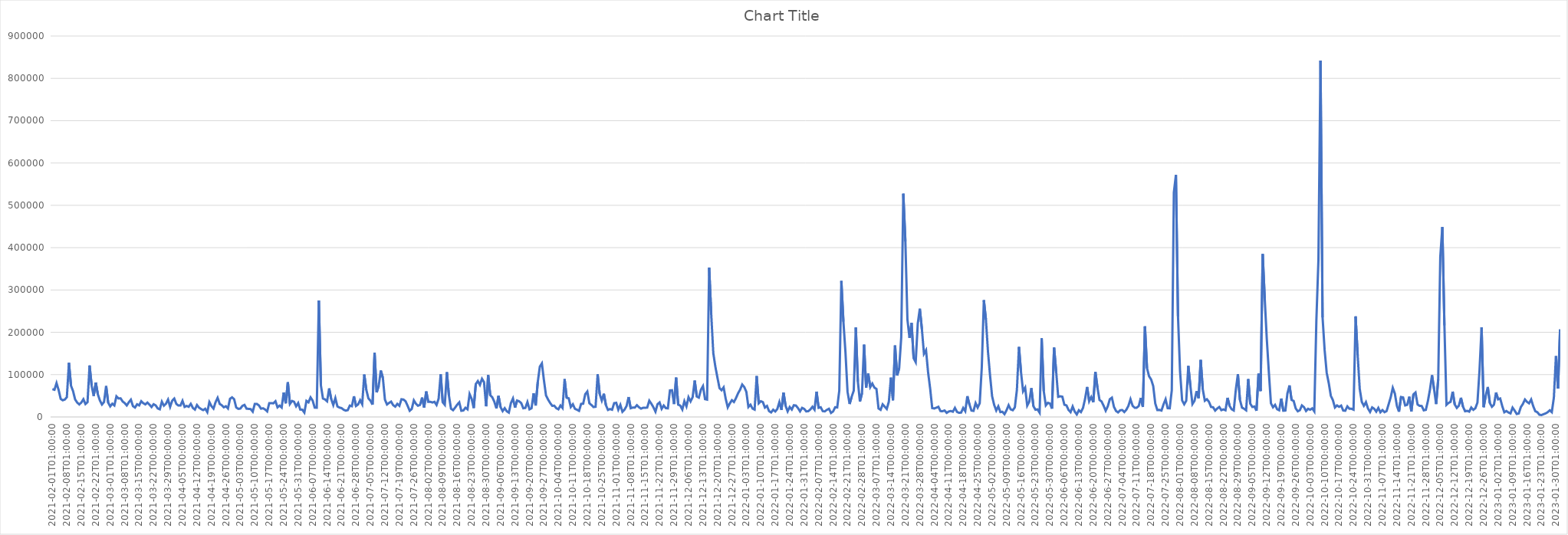
| Category | Series 0 |
|---|---|
| 2021-02-01T01:00:00 | 65672 |
| 2021-02-02T01:00:00 | 64260 |
| 2021-02-03T01:00:00 | 79995 |
| 2021-02-04T01:00:00 | 63845 |
| 2021-02-05T01:00:00 | 42728 |
| 2021-02-06T01:00:00 | 39410 |
| 2021-02-07T01:00:00 | 41108 |
| 2021-02-08T01:00:00 | 46871 |
| 2021-02-09T01:00:00 | 127957 |
| 2021-02-10T01:00:00 | 73947 |
| 2021-02-11T01:00:00 | 61066 |
| 2021-02-12T01:00:00 | 41321 |
| 2021-02-13T01:00:00 | 34094 |
| 2021-02-14T01:00:00 | 29640 |
| 2021-02-15T01:00:00 | 34106 |
| 2021-02-16T01:00:00 | 41888 |
| 2021-02-17T01:00:00 | 30526 |
| 2021-02-18T01:00:00 | 34901 |
| 2021-02-19T01:00:00 | 121660 |
| 2021-02-20T01:00:00 | 73907 |
| 2021-02-21T01:00:00 | 49578 |
| 2021-02-22T01:00:00 | 81334 |
| 2021-02-23T01:00:00 | 53755 |
| 2021-02-24T01:00:00 | 38993 |
| 2021-02-25T01:00:00 | 29401 |
| 2021-02-26T01:00:00 | 35380 |
| 2021-02-27T01:00:00 | 73096 |
| 2021-02-28T01:00:00 | 33897 |
| 2021-03-01T01:00:00 | 24981 |
| 2021-03-02T01:00:00 | 31299 |
| 2021-03-03T01:00:00 | 27234 |
| 2021-03-04T01:00:00 | 48728 |
| 2021-03-05T01:00:00 | 43712 |
| 2021-03-06T01:00:00 | 44058 |
| 2021-03-07T01:00:00 | 36648 |
| 2021-03-08T01:00:00 | 32808 |
| 2021-03-09T01:00:00 | 27239 |
| 2021-03-10T01:00:00 | 34722 |
| 2021-03-11T01:00:00 | 40857 |
| 2021-03-12T01:00:00 | 25597 |
| 2021-03-13T01:00:00 | 22263 |
| 2021-03-14T01:00:00 | 30014 |
| 2021-03-15T00:00:00 | 27374 |
| 2021-03-16T00:00:00 | 37203 |
| 2021-03-17T00:00:00 | 32582 |
| 2021-03-18T00:00:00 | 29691 |
| 2021-03-19T00:00:00 | 33996 |
| 2021-03-20T00:00:00 | 29189 |
| 2021-03-21T00:00:00 | 23487 |
| 2021-03-22T00:00:00 | 30058 |
| 2021-03-23T00:00:00 | 27351 |
| 2021-03-24T00:00:00 | 20125 |
| 2021-03-25T00:00:00 | 18106 |
| 2021-03-26T00:00:00 | 36141 |
| 2021-03-27T00:00:00 | 26642 |
| 2021-03-28T00:00:00 | 31400 |
| 2021-03-29T00:00:00 | 41045 |
| 2021-03-30T00:00:00 | 23882 |
| 2021-03-31T00:00:00 | 38320 |
| 2021-04-01T00:00:00 | 43522 |
| 2021-04-02T00:00:00 | 30898 |
| 2021-04-03T00:00:00 | 27024 |
| 2021-04-04T00:00:00 | 26956 |
| 2021-04-05T00:00:00 | 38240 |
| 2021-04-06T00:00:00 | 23710 |
| 2021-04-07T00:00:00 | 26003 |
| 2021-04-08T00:00:00 | 23984 |
| 2021-04-09T00:00:00 | 31038 |
| 2021-04-10T00:00:00 | 21359 |
| 2021-04-11T00:00:00 | 17455 |
| 2021-04-12T00:00:00 | 28206 |
| 2021-04-13T00:00:00 | 22050 |
| 2021-04-14T00:00:00 | 18752 |
| 2021-04-15T00:00:00 | 16161 |
| 2021-04-16T00:00:00 | 19416 |
| 2021-04-17T00:00:00 | 11334 |
| 2021-04-18T00:00:00 | 35177 |
| 2021-04-19T00:00:00 | 25709 |
| 2021-04-20T00:00:00 | 19833 |
| 2021-04-21T00:00:00 | 34809 |
| 2021-04-22T00:00:00 | 45259 |
| 2021-04-23T00:00:00 | 30862 |
| 2021-04-24T00:00:00 | 27719 |
| 2021-04-25T00:00:00 | 22890 |
| 2021-04-26T00:00:00 | 25357 |
| 2021-04-27T00:00:00 | 20082 |
| 2021-04-28T00:00:00 | 42960 |
| 2021-04-29T00:00:00 | 46387 |
| 2021-04-30T00:00:00 | 41825 |
| 2021-05-01T00:00:00 | 22451 |
| 2021-05-02T00:00:00 | 19210 |
| 2021-05-03T00:00:00 | 19776 |
| 2021-05-04T00:00:00 | 26215 |
| 2021-05-05T00:00:00 | 28557 |
| 2021-05-06T00:00:00 | 19639 |
| 2021-05-07T00:00:00 | 19103 |
| 2021-05-08T00:00:00 | 18651 |
| 2021-05-09T00:00:00 | 12586 |
| 2021-05-10T00:00:00 | 30774 |
| 2021-05-11T00:00:00 | 30790 |
| 2021-05-12T00:00:00 | 27195 |
| 2021-05-13T00:00:00 | 19657 |
| 2021-05-14T00:00:00 | 20478 |
| 2021-05-15T00:00:00 | 17670 |
| 2021-05-16T00:00:00 | 13167 |
| 2021-05-17T00:00:00 | 32656 |
| 2021-05-18T00:00:00 | 32775 |
| 2021-05-19T00:00:00 | 32116 |
| 2021-05-20T00:00:00 | 37208 |
| 2021-05-21T00:00:00 | 22746 |
| 2021-05-22T00:00:00 | 26787 |
| 2021-05-23T00:00:00 | 22321 |
| 2021-05-24T00:00:00 | 57836 |
| 2021-05-25T00:00:00 | 32246 |
| 2021-05-26T00:00:00 | 81969 |
| 2021-05-27T00:00:00 | 30822 |
| 2021-05-28T00:00:00 | 37786 |
| 2021-05-29T00:00:00 | 35920 |
| 2021-05-30T00:00:00 | 25176 |
| 2021-05-31T00:00:00 | 32861 |
| 2021-06-01T00:00:00 | 17646 |
| 2021-06-02T00:00:00 | 17164 |
| 2021-06-03T00:00:00 | 10293 |
| 2021-06-04T00:00:00 | 38009 |
| 2021-06-05T00:00:00 | 34675 |
| 2021-06-06T00:00:00 | 46235 |
| 2021-06-07T00:00:00 | 38835 |
| 2021-06-08T00:00:00 | 22152 |
| 2021-06-09T00:00:00 | 21870 |
| 2021-06-10T00:00:00 | 275252 |
| 2021-06-11T00:00:00 | 74616 |
| 2021-06-12T00:00:00 | 43384 |
| 2021-06-13T00:00:00 | 41416 |
| 2021-06-14T00:00:00 | 36906 |
| 2021-06-15T00:00:00 | 67450 |
| 2021-06-16T00:00:00 | 42242 |
| 2021-06-17T00:00:00 | 28146 |
| 2021-06-18T00:00:00 | 44510 |
| 2021-06-19T00:00:00 | 24843 |
| 2021-06-20T00:00:00 | 22150 |
| 2021-06-21T00:00:00 | 20943 |
| 2021-06-22T00:00:00 | 17123 |
| 2021-06-23T00:00:00 | 14956 |
| 2021-06-24T00:00:00 | 16110 |
| 2021-06-25T00:00:00 | 26907 |
| 2021-06-26T00:00:00 | 25375 |
| 2021-06-27T00:00:00 | 48822 |
| 2021-06-28T00:00:00 | 25978 |
| 2021-06-29T00:00:00 | 29505 |
| 2021-06-30T00:00:00 | 39580 |
| 2021-07-01T00:00:00 | 30052 |
| 2021-07-02T00:00:00 | 100248 |
| 2021-07-03T00:00:00 | 63694 |
| 2021-07-04T00:00:00 | 44030 |
| 2021-07-05T00:00:00 | 38350 |
| 2021-07-06T00:00:00 | 29018 |
| 2021-07-07T00:00:00 | 152164 |
| 2021-07-08T00:00:00 | 58113 |
| 2021-07-09T00:00:00 | 73364 |
| 2021-07-10T00:00:00 | 109778 |
| 2021-07-11T00:00:00 | 92630 |
| 2021-07-12T00:00:00 | 41001 |
| 2021-07-13T00:00:00 | 29524 |
| 2021-07-14T00:00:00 | 33191 |
| 2021-07-15T00:00:00 | 36226 |
| 2021-07-16T00:00:00 | 27824 |
| 2021-07-17T00:00:00 | 24438 |
| 2021-07-18T00:00:00 | 30852 |
| 2021-07-19T00:00:00 | 26362 |
| 2021-07-20T00:00:00 | 41823 |
| 2021-07-21T00:00:00 | 41080 |
| 2021-07-22T00:00:00 | 37055 |
| 2021-07-23T00:00:00 | 26325 |
| 2021-07-24T00:00:00 | 14607 |
| 2021-07-25T00:00:00 | 18933 |
| 2021-07-26T00:00:00 | 39277 |
| 2021-07-27T00:00:00 | 31332 |
| 2021-07-28T00:00:00 | 26533 |
| 2021-07-29T00:00:00 | 28481 |
| 2021-07-30T00:00:00 | 45856 |
| 2021-07-31T00:00:00 | 22383 |
| 2021-08-01T00:00:00 | 60249 |
| 2021-08-02T00:00:00 | 35597 |
| 2021-08-03T00:00:00 | 35816 |
| 2021-08-04T00:00:00 | 34180 |
| 2021-08-05T00:00:00 | 35801 |
| 2021-08-06T00:00:00 | 28451 |
| 2021-08-07T00:00:00 | 42882 |
| 2021-08-08T00:00:00 | 100564 |
| 2021-08-09T00:00:00 | 34582 |
| 2021-08-10T00:00:00 | 28708 |
| 2021-08-11T00:00:00 | 105883 |
| 2021-08-12T00:00:00 | 50389 |
| 2021-08-13T00:00:00 | 19563 |
| 2021-08-14T00:00:00 | 15996 |
| 2021-08-15T00:00:00 | 22111 |
| 2021-08-16T00:00:00 | 29130 |
| 2021-08-17T00:00:00 | 34452 |
| 2021-08-18T00:00:00 | 14557 |
| 2021-08-19T00:00:00 | 15358 |
| 2021-08-20T00:00:00 | 21807 |
| 2021-08-21T00:00:00 | 18116 |
| 2021-08-22T00:00:00 | 54100 |
| 2021-08-23T00:00:00 | 42732 |
| 2021-08-24T00:00:00 | 21084 |
| 2021-08-25T00:00:00 | 77770 |
| 2021-08-26T00:00:00 | 84763 |
| 2021-08-27T00:00:00 | 75836 |
| 2021-08-28T00:00:00 | 90168 |
| 2021-08-29T00:00:00 | 82269 |
| 2021-08-30T00:00:00 | 25286 |
| 2021-08-31T00:00:00 | 99043 |
| 2021-09-01T00:00:00 | 51444 |
| 2021-09-02T00:00:00 | 46396 |
| 2021-09-03T00:00:00 | 35709 |
| 2021-09-04T00:00:00 | 20093 |
| 2021-09-05T00:00:00 | 49844 |
| 2021-09-06T00:00:00 | 23138 |
| 2021-09-07T00:00:00 | 13827 |
| 2021-09-08T00:00:00 | 20747 |
| 2021-09-09T00:00:00 | 13442 |
| 2021-09-10T00:00:00 | 10293 |
| 2021-09-11T00:00:00 | 32770 |
| 2021-09-12T00:00:00 | 43735 |
| 2021-09-13T00:00:00 | 22172 |
| 2021-09-14T00:00:00 | 38833 |
| 2021-09-15T00:00:00 | 36999 |
| 2021-09-16T00:00:00 | 32784 |
| 2021-09-17T00:00:00 | 20556 |
| 2021-09-18T00:00:00 | 21323 |
| 2021-09-19T00:00:00 | 35329 |
| 2021-09-20T00:00:00 | 18109 |
| 2021-09-21T00:00:00 | 20584 |
| 2021-09-22T00:00:00 | 55996 |
| 2021-09-23T00:00:00 | 27077 |
| 2021-09-24T00:00:00 | 82150 |
| 2021-09-25T00:00:00 | 118814 |
| 2021-09-26T00:00:00 | 126527 |
| 2021-09-27T00:00:00 | 86629 |
| 2021-09-28T00:00:00 | 50790 |
| 2021-09-29T00:00:00 | 41155 |
| 2021-09-30T00:00:00 | 33165 |
| 2021-10-01T00:00:00 | 26433 |
| 2021-10-02T00:00:00 | 26520 |
| 2021-10-03T00:00:00 | 20688 |
| 2021-10-04T00:00:00 | 18093 |
| 2021-10-05T00:00:00 | 27022 |
| 2021-10-06T00:00:00 | 21246 |
| 2021-10-07T00:00:00 | 89484 |
| 2021-10-08T00:00:00 | 45358 |
| 2021-10-09T00:00:00 | 44105 |
| 2021-10-10T00:00:00 | 23522 |
| 2021-10-11T00:00:00 | 30016 |
| 2021-10-12T00:00:00 | 19293 |
| 2021-10-13T00:00:00 | 17090 |
| 2021-10-14T00:00:00 | 14427 |
| 2021-10-15T00:00:00 | 30951 |
| 2021-10-16T00:00:00 | 31371 |
| 2021-10-17T00:00:00 | 53865 |
| 2021-10-18T00:00:00 | 60102 |
| 2021-10-19T00:00:00 | 32415 |
| 2021-10-20T00:00:00 | 28184 |
| 2021-10-21T00:00:00 | 23365 |
| 2021-10-22T00:00:00 | 24191 |
| 2021-10-23T00:00:00 | 100782 |
| 2021-10-24T00:00:00 | 54060 |
| 2021-10-25T00:00:00 | 38789 |
| 2021-10-26T00:00:00 | 54945 |
| 2021-10-27T00:00:00 | 28030 |
| 2021-10-28T00:00:00 | 16583 |
| 2021-10-29T00:00:00 | 18741 |
| 2021-10-30T00:00:00 | 17093 |
| 2021-10-31T00:00:00 | 32629 |
| 2021-11-01T00:00:00 | 33486 |
| 2021-11-02T00:00:00 | 17263 |
| 2021-11-03T00:00:00 | 28520 |
| 2021-11-04T00:00:00 | 12155 |
| 2021-11-05T00:00:00 | 17244 |
| 2021-11-06T00:00:00 | 25794 |
| 2021-11-07T00:00:00 | 47032 |
| 2021-11-08T01:00:00 | 20616 |
| 2021-11-09T01:00:00 | 22281 |
| 2021-11-10T01:00:00 | 22108 |
| 2021-11-11T01:00:00 | 27737 |
| 2021-11-12T01:00:00 | 22989 |
| 2021-11-13T01:00:00 | 19714 |
| 2021-11-14T01:00:00 | 21616 |
| 2021-11-15T01:00:00 | 21651 |
| 2021-11-16T01:00:00 | 22176 |
| 2021-11-17T01:00:00 | 38487 |
| 2021-11-18T01:00:00 | 31295 |
| 2021-11-19T01:00:00 | 22983 |
| 2021-11-20T01:00:00 | 12558 |
| 2021-11-21T01:00:00 | 30204 |
| 2021-11-22T01:00:00 | 34311 |
| 2021-11-23T01:00:00 | 19203 |
| 2021-11-24T01:00:00 | 27055 |
| 2021-11-25T01:00:00 | 20861 |
| 2021-11-26T01:00:00 | 20337 |
| 2021-11-27T01:00:00 | 62671 |
| 2021-11-28T01:00:00 | 63131 |
| 2021-11-29T01:00:00 | 30375 |
| 2021-11-30T01:00:00 | 92855 |
| 2021-12-01T01:00:00 | 29150 |
| 2021-12-02T01:00:00 | 26844 |
| 2021-12-03T01:00:00 | 17671 |
| 2021-12-04T01:00:00 | 37128 |
| 2021-12-05T01:00:00 | 25029 |
| 2021-12-06T01:00:00 | 46677 |
| 2021-12-07T01:00:00 | 36782 |
| 2021-12-08T01:00:00 | 46797 |
| 2021-12-09T01:00:00 | 86024 |
| 2021-12-10T01:00:00 | 48376 |
| 2021-12-11T01:00:00 | 45637 |
| 2021-12-12T01:00:00 | 64095 |
| 2021-12-13T01:00:00 | 72784 |
| 2021-12-14T01:00:00 | 42051 |
| 2021-12-15T01:00:00 | 40826 |
| 2021-12-16T01:00:00 | 352617 |
| 2021-12-17T01:00:00 | 242459 |
| 2021-12-18T01:00:00 | 150759 |
| 2021-12-19T01:00:00 | 118842 |
| 2021-12-20T01:00:00 | 93136 |
| 2021-12-21T01:00:00 | 68306 |
| 2021-12-22T01:00:00 | 63130 |
| 2021-12-23T01:00:00 | 69894 |
| 2021-12-24T01:00:00 | 43127 |
| 2021-12-25T01:00:00 | 22736 |
| 2021-12-26T01:00:00 | 32070 |
| 2021-12-27T01:00:00 | 39636 |
| 2021-12-28T01:00:00 | 35391 |
| 2021-12-29T01:00:00 | 44764 |
| 2021-12-30T01:00:00 | 55990 |
| 2021-12-31T01:00:00 | 64654 |
| 2022-01-01T01:00:00 | 76608 |
| 2022-01-02T01:00:00 | 70601 |
| 2022-01-03T01:00:00 | 59465 |
| 2022-01-04T01:00:00 | 23627 |
| 2022-01-05T01:00:00 | 29002 |
| 2022-01-06T01:00:00 | 19791 |
| 2022-01-07T01:00:00 | 17376 |
| 2022-01-08T01:00:00 | 96623 |
| 2022-01-09T01:00:00 | 32295 |
| 2022-01-10T01:00:00 | 37271 |
| 2022-01-11T01:00:00 | 35101 |
| 2022-01-12T01:00:00 | 22147 |
| 2022-01-13T01:00:00 | 25994 |
| 2022-01-14T01:00:00 | 13746 |
| 2022-01-15T01:00:00 | 10725 |
| 2022-01-16T01:00:00 | 17143 |
| 2022-01-17T01:00:00 | 12985 |
| 2022-01-18T01:00:00 | 18897 |
| 2022-01-19T01:00:00 | 35182 |
| 2022-01-20T01:00:00 | 16646 |
| 2022-01-21T01:00:00 | 57508 |
| 2022-01-22T01:00:00 | 26363 |
| 2022-01-23T01:00:00 | 13174 |
| 2022-01-24T01:00:00 | 23536 |
| 2022-01-25T01:00:00 | 17610 |
| 2022-01-26T01:00:00 | 27732 |
| 2022-01-27T01:00:00 | 27000 |
| 2022-01-28T01:00:00 | 21012 |
| 2022-01-29T01:00:00 | 13261 |
| 2022-01-30T01:00:00 | 21467 |
| 2022-01-31T01:00:00 | 19107 |
| 2022-02-01T01:00:00 | 13168 |
| 2022-02-02T01:00:00 | 13669 |
| 2022-02-03T01:00:00 | 17734 |
| 2022-02-04T01:00:00 | 24024 |
| 2022-02-05T01:00:00 | 17293 |
| 2022-02-06T01:00:00 | 59824 |
| 2022-02-07T01:00:00 | 21505 |
| 2022-02-08T01:00:00 | 23034 |
| 2022-02-09T01:00:00 | 13738 |
| 2022-02-10T01:00:00 | 13118 |
| 2022-02-11T01:00:00 | 16879 |
| 2022-02-12T01:00:00 | 19542 |
| 2022-02-13T01:00:00 | 9393 |
| 2022-02-14T01:00:00 | 12931 |
| 2022-02-15T01:00:00 | 22986 |
| 2022-02-16T01:00:00 | 22523 |
| 2022-02-17T01:00:00 | 62092 |
| 2022-02-18T01:00:00 | 321465 |
| 2022-02-19T01:00:00 | 225341 |
| 2022-02-20T01:00:00 | 152486 |
| 2022-02-21T01:00:00 | 59463 |
| 2022-02-22T01:00:00 | 30562 |
| 2022-02-23T01:00:00 | 47752 |
| 2022-02-24T01:00:00 | 61857 |
| 2022-02-25T01:00:00 | 211515 |
| 2022-02-26T01:00:00 | 83686 |
| 2022-02-27T01:00:00 | 36496 |
| 2022-02-28T01:00:00 | 56110 |
| 2022-03-01T01:00:00 | 170923 |
| 2022-03-02T01:00:00 | 69180 |
| 2022-03-03T01:00:00 | 102516 |
| 2022-03-04T01:00:00 | 70507 |
| 2022-03-05T01:00:00 | 78852 |
| 2022-03-06T01:00:00 | 69358 |
| 2022-03-07T01:00:00 | 66237 |
| 2022-03-08T01:00:00 | 20061 |
| 2022-03-09T01:00:00 | 16847 |
| 2022-03-10T01:00:00 | 29828 |
| 2022-03-11T01:00:00 | 24414 |
| 2022-03-12T01:00:00 | 18921 |
| 2022-03-13T01:00:00 | 36163 |
| 2022-03-14T00:00:00 | 92951 |
| 2022-03-15T00:00:00 | 39426 |
| 2022-03-16T00:00:00 | 168879 |
| 2022-03-17T00:00:00 | 97923 |
| 2022-03-18T00:00:00 | 115005 |
| 2022-03-19T00:00:00 | 188512 |
| 2022-03-20T00:00:00 | 527535 |
| 2022-03-21T00:00:00 | 414820 |
| 2022-03-22T00:00:00 | 230133 |
| 2022-03-23T00:00:00 | 186902 |
| 2022-03-24T00:00:00 | 221971 |
| 2022-03-25T00:00:00 | 138855 |
| 2022-03-26T00:00:00 | 129630 |
| 2022-03-27T00:00:00 | 220591 |
| 2022-03-28T00:00:00 | 255724 |
| 2022-03-29T00:00:00 | 207561 |
| 2022-03-30T00:00:00 | 149214 |
| 2022-03-31T00:00:00 | 157800 |
| 2022-04-01T00:00:00 | 105536 |
| 2022-04-02T00:00:00 | 67170 |
| 2022-04-03T00:00:00 | 20969 |
| 2022-04-04T00:00:00 | 20050 |
| 2022-04-05T00:00:00 | 21915 |
| 2022-04-06T00:00:00 | 24003 |
| 2022-04-07T00:00:00 | 13859 |
| 2022-04-08T00:00:00 | 13592 |
| 2022-04-09T00:00:00 | 15234 |
| 2022-04-10T00:00:00 | 9689 |
| 2022-04-11T00:00:00 | 12863 |
| 2022-04-12T00:00:00 | 14092 |
| 2022-04-13T00:00:00 | 12445 |
| 2022-04-14T00:00:00 | 21455 |
| 2022-04-15T00:00:00 | 11947 |
| 2022-04-16T00:00:00 | 9754 |
| 2022-04-17T00:00:00 | 10400 |
| 2022-04-18T00:00:00 | 21337 |
| 2022-04-19T00:00:00 | 13706 |
| 2022-04-20T00:00:00 | 49089 |
| 2022-04-21T00:00:00 | 29879 |
| 2022-04-22T00:00:00 | 15085 |
| 2022-04-23T00:00:00 | 14468 |
| 2022-04-24T00:00:00 | 32813 |
| 2022-04-25T00:00:00 | 22299 |
| 2022-04-26T00:00:00 | 32329 |
| 2022-04-27T00:00:00 | 117297 |
| 2022-04-28T00:00:00 | 275978 |
| 2022-04-29T00:00:00 | 230174 |
| 2022-04-30T00:00:00 | 154042 |
| 2022-05-01T00:00:00 | 98201 |
| 2022-05-02T00:00:00 | 48786 |
| 2022-05-03T00:00:00 | 28458 |
| 2022-05-04T00:00:00 | 15343 |
| 2022-05-05T00:00:00 | 25097 |
| 2022-05-06T00:00:00 | 11522 |
| 2022-05-07T00:00:00 | 12280 |
| 2022-05-08T00:00:00 | 6702 |
| 2022-05-09T00:00:00 | 15970 |
| 2022-05-10T00:00:00 | 27766 |
| 2022-05-11T00:00:00 | 17934 |
| 2022-05-12T00:00:00 | 15915 |
| 2022-05-13T00:00:00 | 22557 |
| 2022-05-14T00:00:00 | 63868 |
| 2022-05-15T00:00:00 | 165475 |
| 2022-05-16T00:00:00 | 105065 |
| 2022-05-17T00:00:00 | 60671 |
| 2022-05-18T00:00:00 | 69154 |
| 2022-05-19T00:00:00 | 26957 |
| 2022-05-20T00:00:00 | 36311 |
| 2022-05-21T00:00:00 | 68112 |
| 2022-05-22T00:00:00 | 25486 |
| 2022-05-23T00:00:00 | 17111 |
| 2022-05-24T00:00:00 | 17868 |
| 2022-05-25T00:00:00 | 10074 |
| 2022-05-26T00:00:00 | 185834 |
| 2022-05-27T00:00:00 | 61407 |
| 2022-05-28T00:00:00 | 27239 |
| 2022-05-29T00:00:00 | 33354 |
| 2022-05-30T00:00:00 | 31928 |
| 2022-05-31T00:00:00 | 19753 |
| 2022-06-01T00:00:00 | 163861 |
| 2022-06-02T00:00:00 | 107755 |
| 2022-06-03T00:00:00 | 47494 |
| 2022-06-04T00:00:00 | 48892 |
| 2022-06-05T00:00:00 | 47905 |
| 2022-06-06T00:00:00 | 28815 |
| 2022-06-07T00:00:00 | 27348 |
| 2022-06-08T00:00:00 | 16737 |
| 2022-06-09T00:00:00 | 11416 |
| 2022-06-10T00:00:00 | 24743 |
| 2022-06-11T00:00:00 | 12592 |
| 2022-06-12T00:00:00 | 6003 |
| 2022-06-13T00:00:00 | 15900 |
| 2022-06-14T00:00:00 | 11555 |
| 2022-06-15T00:00:00 | 21080 |
| 2022-06-16T00:00:00 | 42529 |
| 2022-06-17T00:00:00 | 70885 |
| 2022-06-18T00:00:00 | 37184 |
| 2022-06-19T00:00:00 | 47117 |
| 2022-06-20T00:00:00 | 34899 |
| 2022-06-21T00:00:00 | 106681 |
| 2022-06-22T00:00:00 | 69366 |
| 2022-06-23T00:00:00 | 40235 |
| 2022-06-24T00:00:00 | 36591 |
| 2022-06-25T00:00:00 | 26424 |
| 2022-06-26T00:00:00 | 14726 |
| 2022-06-27T00:00:00 | 25082 |
| 2022-06-28T00:00:00 | 41988 |
| 2022-06-29T00:00:00 | 45625 |
| 2022-06-30T00:00:00 | 23685 |
| 2022-07-01T00:00:00 | 14144 |
| 2022-07-02T00:00:00 | 10729 |
| 2022-07-03T00:00:00 | 15867 |
| 2022-07-04T00:00:00 | 16378 |
| 2022-07-05T00:00:00 | 11601 |
| 2022-07-06T00:00:00 | 17121 |
| 2022-07-07T00:00:00 | 26314 |
| 2022-07-08T00:00:00 | 41843 |
| 2022-07-09T00:00:00 | 26766 |
| 2022-07-10T00:00:00 | 21905 |
| 2022-07-11T00:00:00 | 21893 |
| 2022-07-12T00:00:00 | 25875 |
| 2022-07-13T00:00:00 | 45095 |
| 2022-07-14T00:00:00 | 23712 |
| 2022-07-15T00:00:00 | 214040 |
| 2022-07-16T00:00:00 | 115229 |
| 2022-07-17T00:00:00 | 96350 |
| 2022-07-18T00:00:00 | 88440 |
| 2022-07-19T00:00:00 | 73129 |
| 2022-07-20T00:00:00 | 31600 |
| 2022-07-21T00:00:00 | 16385 |
| 2022-07-22T00:00:00 | 16554 |
| 2022-07-23T00:00:00 | 15170 |
| 2022-07-24T00:00:00 | 29841 |
| 2022-07-25T00:00:00 | 41750 |
| 2022-07-26T00:00:00 | 20654 |
| 2022-07-27T00:00:00 | 20579 |
| 2022-07-28T00:00:00 | 63277 |
| 2022-07-29T00:00:00 | 530562 |
| 2022-07-30T00:00:00 | 571868 |
| 2022-07-31T00:00:00 | 238718 |
| 2022-08-01T00:00:00 | 107339 |
| 2022-08-02T00:00:00 | 39211 |
| 2022-08-03T00:00:00 | 30051 |
| 2022-08-04T00:00:00 | 38425 |
| 2022-08-05T00:00:00 | 120802 |
| 2022-08-06T00:00:00 | 73366 |
| 2022-08-07T00:00:00 | 30537 |
| 2022-08-08T00:00:00 | 37968 |
| 2022-08-09T00:00:00 | 60909 |
| 2022-08-10T00:00:00 | 44391 |
| 2022-08-11T00:00:00 | 134688 |
| 2022-08-12T00:00:00 | 65327 |
| 2022-08-13T00:00:00 | 38359 |
| 2022-08-14T00:00:00 | 41918 |
| 2022-08-15T00:00:00 | 35812 |
| 2022-08-16T00:00:00 | 23762 |
| 2022-08-17T00:00:00 | 22964 |
| 2022-08-18T00:00:00 | 15058 |
| 2022-08-19T00:00:00 | 19892 |
| 2022-08-20T00:00:00 | 23550 |
| 2022-08-21T00:00:00 | 16072 |
| 2022-08-22T00:00:00 | 17901 |
| 2022-08-23T00:00:00 | 15820 |
| 2022-08-24T00:00:00 | 45210 |
| 2022-08-25T00:00:00 | 25936 |
| 2022-08-26T00:00:00 | 18210 |
| 2022-08-27T00:00:00 | 15357 |
| 2022-08-28T00:00:00 | 64441 |
| 2022-08-29T00:00:00 | 101001 |
| 2022-08-30T00:00:00 | 40314 |
| 2022-08-31T00:00:00 | 22017 |
| 2022-09-01T00:00:00 | 19478 |
| 2022-09-02T00:00:00 | 15763 |
| 2022-09-03T00:00:00 | 89563 |
| 2022-09-04T00:00:00 | 31414 |
| 2022-09-05T00:00:00 | 23607 |
| 2022-09-06T00:00:00 | 24690 |
| 2022-09-07T00:00:00 | 14562 |
| 2022-09-08T00:00:00 | 102309 |
| 2022-09-09T00:00:00 | 61184 |
| 2022-09-10T00:00:00 | 384967 |
| 2022-09-11T00:00:00 | 279576 |
| 2022-09-12T00:00:00 | 184073 |
| 2022-09-13T00:00:00 | 105297 |
| 2022-09-14T00:00:00 | 32462 |
| 2022-09-15T00:00:00 | 22909 |
| 2022-09-16T00:00:00 | 28661 |
| 2022-09-17T00:00:00 | 18296 |
| 2022-09-18T00:00:00 | 15701 |
| 2022-09-19T00:00:00 | 43523 |
| 2022-09-20T00:00:00 | 14738 |
| 2022-09-21T00:00:00 | 15177 |
| 2022-09-22T00:00:00 | 55924 |
| 2022-09-23T00:00:00 | 74533 |
| 2022-09-24T00:00:00 | 40245 |
| 2022-09-25T00:00:00 | 37874 |
| 2022-09-26T00:00:00 | 20196 |
| 2022-09-27T00:00:00 | 13288 |
| 2022-09-28T00:00:00 | 15833 |
| 2022-09-29T00:00:00 | 27146 |
| 2022-09-30T00:00:00 | 23264 |
| 2022-10-01T00:00:00 | 14207 |
| 2022-10-02T00:00:00 | 19269 |
| 2022-10-03T00:00:00 | 17038 |
| 2022-10-04T00:00:00 | 20399 |
| 2022-10-05T00:00:00 | 13148 |
| 2022-10-06T00:00:00 | 227480 |
| 2022-10-07T00:00:00 | 370930 |
| 2022-10-08T00:00:00 | 842110 |
| 2022-10-09T00:00:00 | 235469 |
| 2022-10-10T00:00:00 | 158128 |
| 2022-10-11T00:00:00 | 104605 |
| 2022-10-12T00:00:00 | 79898 |
| 2022-10-13T00:00:00 | 50056 |
| 2022-10-14T00:00:00 | 39590 |
| 2022-10-15T00:00:00 | 22406 |
| 2022-10-16T00:00:00 | 27214 |
| 2022-10-17T00:00:00 | 23975 |
| 2022-10-18T00:00:00 | 26714 |
| 2022-10-19T00:00:00 | 15416 |
| 2022-10-20T00:00:00 | 14888 |
| 2022-10-21T00:00:00 | 25018 |
| 2022-10-22T00:00:00 | 19296 |
| 2022-10-23T00:00:00 | 19418 |
| 2022-10-24T00:00:00 | 17338 |
| 2022-10-25T00:00:00 | 237546 |
| 2022-10-26T00:00:00 | 145742 |
| 2022-10-27T00:00:00 | 66301 |
| 2022-10-28T00:00:00 | 35683 |
| 2022-10-29T00:00:00 | 26423 |
| 2022-10-30T00:00:00 | 35075 |
| 2022-10-31T00:00:00 | 19956 |
| 2022-11-01T00:00:00 | 11885 |
| 2022-11-02T00:00:00 | 22591 |
| 2022-11-03T00:00:00 | 19344 |
| 2022-11-04T00:00:00 | 12512 |
| 2022-11-05T00:00:00 | 21344 |
| 2022-11-06T00:00:00 | 11027 |
| 2022-11-07T01:00:00 | 16363 |
| 2022-11-08T01:00:00 | 11277 |
| 2022-11-09T01:00:00 | 13914 |
| 2022-11-10T01:00:00 | 30097 |
| 2022-11-11T01:00:00 | 46549 |
| 2022-11-12T01:00:00 | 68778 |
| 2022-11-13T01:00:00 | 55396 |
| 2022-11-14T01:00:00 | 26229 |
| 2022-11-15T01:00:00 | 12454 |
| 2022-11-16T01:00:00 | 47132 |
| 2022-11-17T01:00:00 | 46113 |
| 2022-11-18T01:00:00 | 27256 |
| 2022-11-19T01:00:00 | 28724 |
| 2022-11-20T01:00:00 | 47923 |
| 2022-11-21T01:00:00 | 13143 |
| 2022-11-22T01:00:00 | 53368 |
| 2022-11-23T01:00:00 | 57766 |
| 2022-11-24T01:00:00 | 29470 |
| 2022-11-25T01:00:00 | 26287 |
| 2022-11-26T01:00:00 | 25955 |
| 2022-11-27T01:00:00 | 15673 |
| 2022-11-28T01:00:00 | 16768 |
| 2022-11-29T01:00:00 | 37485 |
| 2022-11-30T01:00:00 | 64564 |
| 2022-12-01T01:00:00 | 98628 |
| 2022-12-02T01:00:00 | 65677 |
| 2022-12-03T01:00:00 | 30426 |
| 2022-12-04T01:00:00 | 88738 |
| 2022-12-05T01:00:00 | 378229 |
| 2022-12-06T01:00:00 | 448701 |
| 2022-12-07T01:00:00 | 216379 |
| 2022-12-08T01:00:00 | 28780 |
| 2022-12-09T01:00:00 | 33277 |
| 2022-12-10T01:00:00 | 35955 |
| 2022-12-11T01:00:00 | 59865 |
| 2022-12-12T01:00:00 | 29541 |
| 2022-12-13T01:00:00 | 21397 |
| 2022-12-14T01:00:00 | 26792 |
| 2022-12-15T01:00:00 | 45345 |
| 2022-12-16T01:00:00 | 24204 |
| 2022-12-17T01:00:00 | 13601 |
| 2022-12-18T01:00:00 | 14597 |
| 2022-12-19T01:00:00 | 12645 |
| 2022-12-20T01:00:00 | 22248 |
| 2022-12-21T01:00:00 | 16768 |
| 2022-12-22T01:00:00 | 20600 |
| 2022-12-23T01:00:00 | 34136 |
| 2022-12-24T01:00:00 | 110463 |
| 2022-12-25T01:00:00 | 211800 |
| 2022-12-26T01:00:00 | 23087 |
| 2022-12-27T01:00:00 | 50252 |
| 2022-12-28T01:00:00 | 70789 |
| 2022-12-29T01:00:00 | 32834 |
| 2022-12-30T01:00:00 | 24136 |
| 2022-12-31T01:00:00 | 29116 |
| 2023-01-01T01:00:00 | 57677 |
| 2023-01-02T01:00:00 | 41658 |
| 2023-01-03T01:00:00 | 43639 |
| 2023-01-04T01:00:00 | 25874 |
| 2023-01-05T01:00:00 | 11079 |
| 2023-01-06T01:00:00 | 14076 |
| 2023-01-07T01:00:00 | 10567 |
| 2023-01-08T01:00:00 | 8446 |
| 2023-01-09T01:00:00 | 22077 |
| 2023-01-10T01:00:00 | 15088 |
| 2023-01-11T01:00:00 | 7045 |
| 2023-01-12T01:00:00 | 8223 |
| 2023-01-13T01:00:00 | 23291 |
| 2023-01-14T01:00:00 | 30795 |
| 2023-01-15T01:00:00 | 41230 |
| 2023-01-16T01:00:00 | 35648 |
| 2023-01-17T01:00:00 | 32269 |
| 2023-01-18T01:00:00 | 41253 |
| 2023-01-19T01:00:00 | 25533 |
| 2023-01-20T01:00:00 | 13603 |
| 2023-01-21T01:00:00 | 11208 |
| 2023-01-22T01:00:00 | 5262 |
| 2023-01-23T01:00:00 | 4532 |
| 2023-01-24T01:00:00 | 6514 |
| 2023-01-25T01:00:00 | 8388 |
| 2023-01-26T01:00:00 | 11180 |
| 2023-01-27T01:00:00 | 15809 |
| 2023-01-28T01:00:00 | 11314 |
| 2023-01-29T01:00:00 | 45699 |
| 2023-01-30T01:00:00 | 143899 |
| 2023-01-31T01:00:00 | 67015 |
| 2023-02-01T01:00:00 | 206751 |